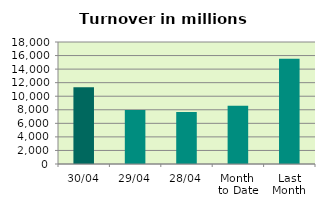
| Category | Series 0 |
|---|---|
| 30/04 | 11339.089 |
| 29/04 | 7955.091 |
| 28/04 | 7660.936 |
| Month 
to Date | 8604.869 |
| Last
Month | 15518.097 |